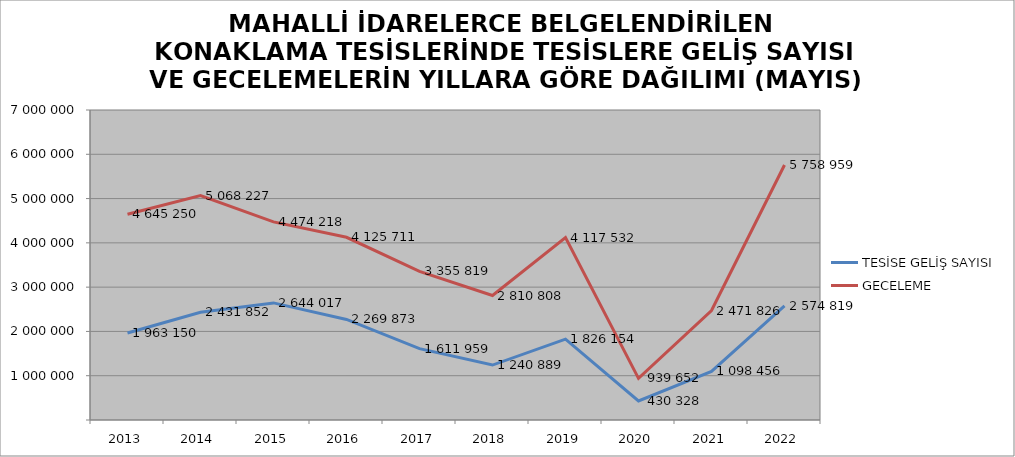
| Category | TESİSE GELİŞ SAYISI | GECELEME |
|---|---|---|
| 2013 | 1963150 | 4645250 |
| 2014 | 2431852 | 5068227 |
| 2015 | 2644017 | 4474218 |
| 2016 | 2269873 | 4125711 |
| 2017 | 1611959 | 3355819 |
| 2018 | 1240889 | 2810808 |
| 2019 | 1826154 | 4117532 |
| 2020 | 430328 | 939652 |
| 2021 | 1098456 | 2471826 |
| 2022 | 2574819 | 5758959 |